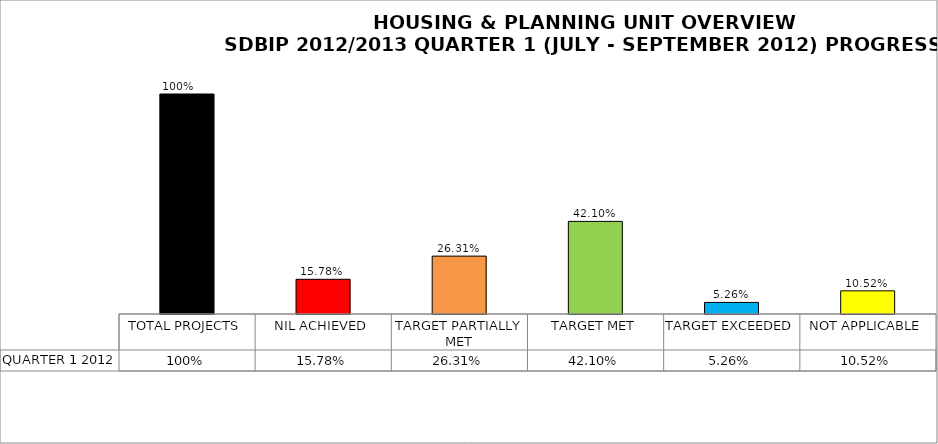
| Category | QUARTER 1 2012 |
|---|---|
| TOTAL PROJECTS | 1 |
| NIL ACHIEVED | 0.158 |
| TARGET PARTIALLY MET | 0.263 |
| TARGET MET | 0.421 |
| TARGET EXCEEDED | 0.053 |
| NOT APPLICABLE | 0.105 |